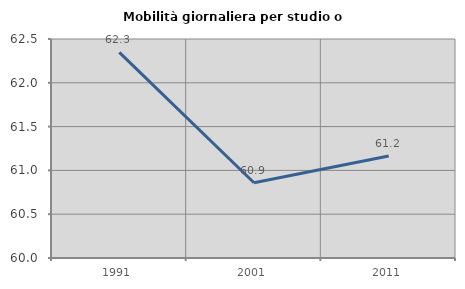
| Category | Mobilità giornaliera per studio o lavoro |
|---|---|
| 1991.0 | 62.347 |
| 2001.0 | 60.859 |
| 2011.0 | 61.165 |